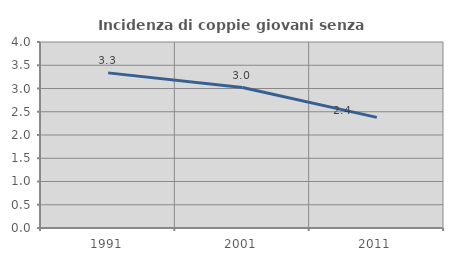
| Category | Incidenza di coppie giovani senza figli |
|---|---|
| 1991.0 | 3.336 |
| 2001.0 | 3.02 |
| 2011.0 | 2.379 |